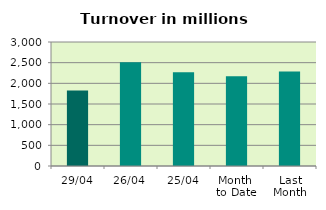
| Category | Series 0 |
|---|---|
| 29/04 | 1827.663 |
| 26/04 | 2508.775 |
| 25/04 | 2267.64 |
| Month 
to Date | 2170.166 |
| Last
Month | 2286.259 |